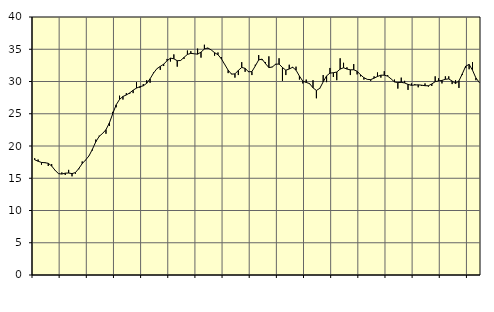
| Category | Piggar | Series 1 |
|---|---|---|
| nan | 18.1 | 17.86 |
| 87.0 | 17.9 | 17.64 |
| 87.0 | 17.1 | 17.45 |
| 87.0 | 17.5 | 17.41 |
| nan | 16.9 | 17.32 |
| 88.0 | 17.2 | 16.9 |
| 88.0 | 16.2 | 16.24 |
| 88.0 | 15.7 | 15.72 |
| nan | 15.9 | 15.65 |
| 89.0 | 15.5 | 15.79 |
| 89.0 | 16.3 | 15.81 |
| 89.0 | 15.3 | 15.72 |
| nan | 15.7 | 15.88 |
| 90.0 | 16.4 | 16.51 |
| 90.0 | 17.6 | 17.27 |
| 90.0 | 17.8 | 17.83 |
| nan | 18.5 | 18.47 |
| 91.0 | 19.3 | 19.49 |
| 91.0 | 21 | 20.65 |
| 91.0 | 21.6 | 21.49 |
| nan | 21.9 | 21.95 |
| 92.0 | 21.9 | 22.53 |
| 92.0 | 23.1 | 23.57 |
| 92.0 | 25.3 | 25.01 |
| nan | 26 | 26.38 |
| 93.0 | 27.8 | 27.22 |
| 93.0 | 27.2 | 27.68 |
| 93.0 | 28.2 | 27.91 |
| nan | 28.1 | 28.23 |
| 94.0 | 28.2 | 28.65 |
| 94.0 | 29.9 | 28.98 |
| 94.0 | 29 | 29.2 |
| nan | 29.6 | 29.33 |
| 95.0 | 30.2 | 29.72 |
| 95.0 | 29.8 | 30.42 |
| 95.0 | 31.4 | 31.3 |
| nan | 32 | 31.98 |
| 96.0 | 31.8 | 32.34 |
| 96.0 | 32.4 | 32.68 |
| 96.0 | 33.5 | 33.22 |
| nan | 33.1 | 33.62 |
| 97.0 | 34.2 | 33.52 |
| 97.0 | 32.3 | 33.22 |
| 97.0 | 33.3 | 33.26 |
| nan | 33.5 | 33.74 |
| 98.0 | 34.8 | 34.2 |
| 98.0 | 34.7 | 34.36 |
| 98.0 | 34.3 | 34.3 |
| nan | 35.1 | 34.24 |
| 99.0 | 33.7 | 34.55 |
| 99.0 | 35.7 | 35.04 |
| 99.0 | 35.1 | 35.2 |
| nan | 34.9 | 34.9 |
| 0.0 | 34 | 34.47 |
| 0.0 | 34.5 | 34.15 |
| 0.0 | 33.8 | 33.52 |
| nan | 32.6 | 32.63 |
| 1.0 | 31.3 | 31.75 |
| 1.0 | 31.2 | 31.14 |
| 1.0 | 30.6 | 31.18 |
| nan | 31 | 31.72 |
| 2.0 | 33 | 32.18 |
| 2.0 | 31.5 | 32.04 |
| 2.0 | 31.6 | 31.5 |
| nan | 31 | 31.54 |
| 3.0 | 32.6 | 32.41 |
| 3.0 | 34.1 | 33.35 |
| 3.0 | 33.3 | 33.47 |
| nan | 33 | 32.77 |
| 4.0 | 33.9 | 32.16 |
| 4.0 | 32.3 | 32.24 |
| 4.0 | 32.6 | 32.69 |
| nan | 33.6 | 32.7 |
| 5.0 | 30.1 | 32.17 |
| 5.0 | 31 | 31.75 |
| 5.0 | 32.6 | 31.94 |
| nan | 32.1 | 32.21 |
| 6.0 | 32.3 | 31.76 |
| 6.0 | 30.3 | 30.84 |
| 6.0 | 29.7 | 30.05 |
| nan | 30.3 | 29.86 |
| 7.0 | 29.6 | 29.67 |
| 7.0 | 30.2 | 29.02 |
| 7.0 | 27.4 | 28.61 |
| nan | 28.9 | 28.94 |
| 8.0 | 31 | 29.94 |
| 8.0 | 29.9 | 30.87 |
| 8.0 | 32.1 | 31.3 |
| nan | 30.7 | 31.36 |
| 9.0 | 30.2 | 31.47 |
| 9.0 | 33.6 | 31.92 |
| 9.0 | 32.9 | 32.13 |
| nan | 32.2 | 31.93 |
| 10.0 | 31 | 31.81 |
| 10.0 | 32.7 | 31.82 |
| 10.0 | 31.1 | 31.59 |
| nan | 30.8 | 31.04 |
| 11.0 | 30.3 | 30.59 |
| 11.0 | 30.3 | 30.33 |
| 11.0 | 30.1 | 30.29 |
| nan | 30.8 | 30.52 |
| 12.0 | 31.4 | 30.78 |
| 12.0 | 30.6 | 30.98 |
| 12.0 | 31.6 | 30.98 |
| nan | 31 | 30.83 |
| 13.0 | 30.4 | 30.41 |
| 13.0 | 30.3 | 29.93 |
| 13.0 | 28.9 | 29.83 |
| nan | 30.6 | 29.87 |
| 14.0 | 30.1 | 29.77 |
| 14.0 | 28.7 | 29.55 |
| 14.0 | 29.7 | 29.41 |
| nan | 29.6 | 29.46 |
| 15.0 | 29.1 | 29.48 |
| 15.0 | 29.3 | 29.43 |
| 15.0 | 29.7 | 29.35 |
| nan | 29.2 | 29.34 |
| 16.0 | 29.3 | 29.62 |
| 16.0 | 30.8 | 29.97 |
| 16.0 | 30.5 | 30.09 |
| nan | 29.7 | 30.17 |
| 17.0 | 30.8 | 30.34 |
| 17.0 | 30.8 | 30.4 |
| 17.0 | 29.6 | 30.07 |
| nan | 30.2 | 29.69 |
| 18.0 | 29 | 30.09 |
| 18.0 | 31 | 31.2 |
| 18.0 | 32.1 | 32.38 |
| nan | 31.9 | 32.65 |
| 19.0 | 33 | 31.75 |
| 19.0 | 30.2 | 30.55 |
| 19.0 | 29.8 | 29.86 |